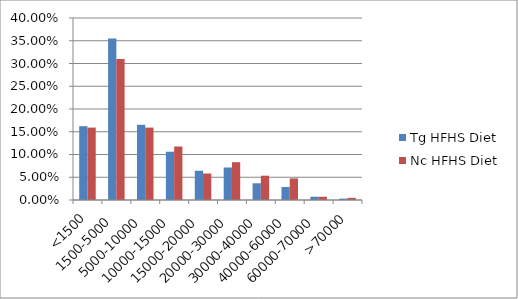
| Category | Tg HFHS Diet | Nc HFHS Diet |
|---|---|---|
| <1500 | 0.162 | 0.159 |
| 1500-5000 | 0.355 | 0.31 |
| 5000-10000 | 0.165 | 0.159 |
| 10000-15000 | 0.106 | 0.118 |
| 15000-20000 | 0.064 | 0.058 |
| 20000-30000 | 0.071 | 0.083 |
| 30000-40000 | 0.037 | 0.053 |
| 40000-60000 | 0.029 | 0.048 |
| 60000-70000 | 0.007 | 0.007 |
| >70000 | 0.003 | 0.005 |